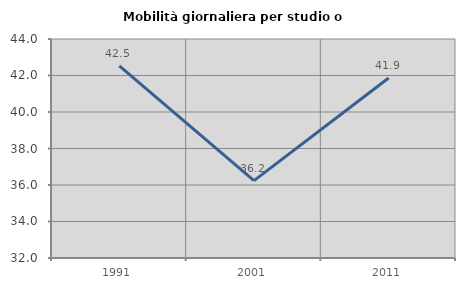
| Category | Mobilità giornaliera per studio o lavoro |
|---|---|
| 1991.0 | 42.53 |
| 2001.0 | 36.238 |
| 2011.0 | 41.865 |